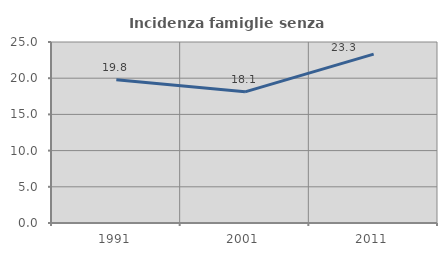
| Category | Incidenza famiglie senza nuclei |
|---|---|
| 1991.0 | 19.794 |
| 2001.0 | 18.116 |
| 2011.0 | 23.333 |